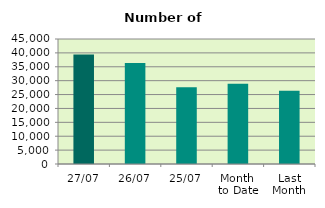
| Category | Series 0 |
|---|---|
| 27/07 | 39386 |
| 26/07 | 36340 |
| 25/07 | 27606 |
| Month 
to Date | 28861.895 |
| Last
Month | 26399.455 |